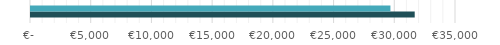
| Category | Series 0 | Series 1 |
|---|---|---|
| 0 | 31600 | 29600 |